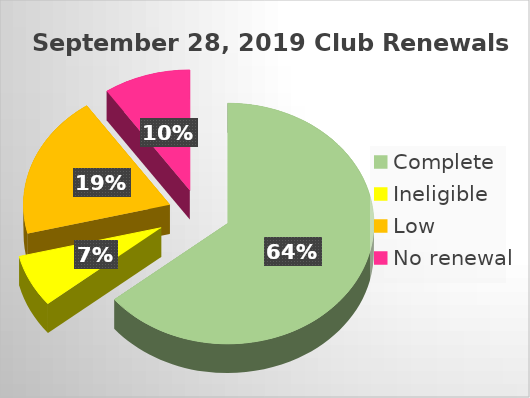
| Category | Series 0 |
|---|---|
| Complete | 0.641 |
| Ineligible | 0.071 |
| Low | 0.192 |
| No renewal | 0.096 |